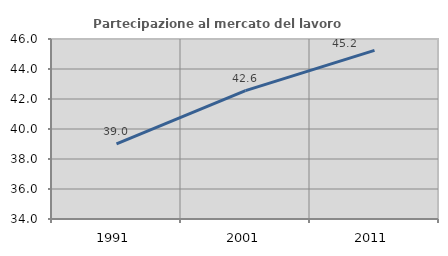
| Category | Partecipazione al mercato del lavoro  femminile |
|---|---|
| 1991.0 | 39.003 |
| 2001.0 | 42.558 |
| 2011.0 | 45.238 |